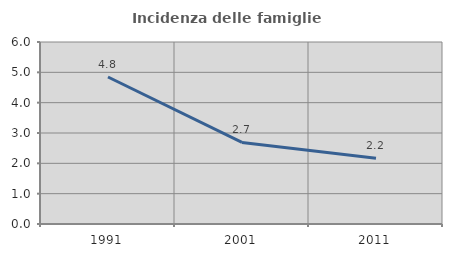
| Category | Incidenza delle famiglie numerose |
|---|---|
| 1991.0 | 4.847 |
| 2001.0 | 2.689 |
| 2011.0 | 2.165 |